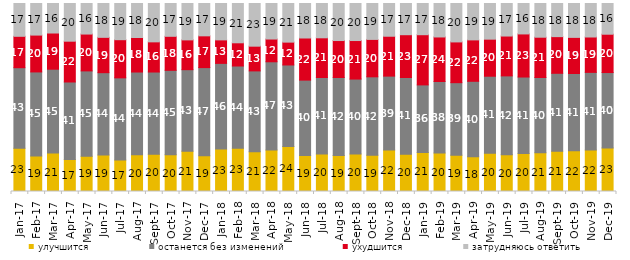
| Category | улучшится | останется без изменений | ухудшится | затрудняюсь ответить |
|---|---|---|---|---|
| 2017-01-01 | 23 | 42.85 | 16.7 | 17.45 |
| 2017-02-01 | 18.85 | 44.75 | 19.6 | 16.8 |
| 2017-03-01 | 20.5 | 44.55 | 19.25 | 15.7 |
| 2017-04-01 | 17 | 41.25 | 21.7 | 20.05 |
| 2017-05-01 | 18.7 | 45.45 | 19.6 | 16.25 |
| 2017-06-01 | 19.4 | 43.8 | 18.8 | 18 |
| 2017-07-01 | 16.7 | 43.75 | 20.3 | 19.25 |
| 2017-08-01 | 19.5 | 44.05 | 18.35 | 18.1 |
| 2017-09-01 | 19.8 | 43.75 | 16.05 | 20.4 |
| 2017-10-01 | 19.55 | 44.9 | 18.1 | 17.45 |
| 2017-11-01 | 21.45 | 43.35 | 15.85 | 19.35 |
| 2017-12-01 | 18.95 | 46.95 | 16.9 | 17.2 |
| 2018-01-01 | 22.55 | 45.6 | 12.5 | 19.35 |
| 2018-02-01 | 23 | 43.75 | 12.35 | 20.9 |
| 2018-03-01 | 21.15 | 43 | 13.15 | 22.7 |
| 2018-04-01 | 22.05 | 46.95 | 12.1 | 18.9 |
| 2018-05-01 | 23.95 | 43.35 | 12.15 | 20.55 |
| 2018-06-01 | 19.15 | 40.1 | 22.4 | 18.35 |
| 2018-07-01 | 19.95 | 40.7 | 21.1 | 18.25 |
| 2018-08-01 | 19.15 | 41.5 | 19.65 | 19.7 |
| 2018-09-01 | 19.95 | 39.85 | 20.5 | 19.7 |
| 2018-10-01 | 19.3 | 41.7 | 19.9 | 19.1 |
| 2018-11-01 | 22.056 | 39.321 | 21.208 | 17.415 |
| 2018-12-01 | 19.8 | 40.85 | 22.75 | 16.6 |
| 2019-01-01 | 20.75 | 35.95 | 26.7 | 16.6 |
| 2019-02-01 | 20.45 | 38.05 | 23.7 | 17.8 |
| 2019-03-01 | 19.344 | 38.538 | 21.681 | 20.438 |
| 2019-04-01 | 18.465 | 40.149 | 22.03 | 19.356 |
| 2019-05-01 | 20.406 | 40.911 | 19.713 | 18.97 |
| 2019-06-01 | 19.601 | 41.895 | 21.197 | 17.307 |
| 2019-07-01 | 20.149 | 40.743 | 22.921 | 16.188 |
| 2019-08-01 | 20.579 | 40.06 | 21.429 | 17.932 |
| 2019-09-01 | 21.386 | 41.485 | 19.505 | 17.624 |
| 2019-10-01 | 21.683 | 41.089 | 19.208 | 18.02 |
| 2019-11-01 | 22.03 | 41.337 | 18.812 | 17.822 |
| 2019-12-01 | 23.168 | 40.099 | 20.396 | 16.337 |